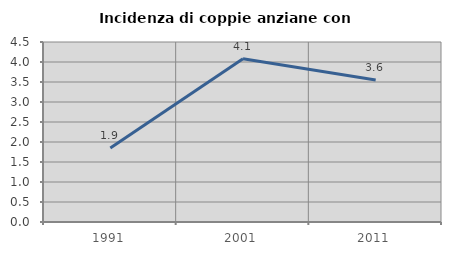
| Category | Incidenza di coppie anziane con figli |
|---|---|
| 1991.0 | 1.852 |
| 2001.0 | 4.082 |
| 2011.0 | 3.55 |